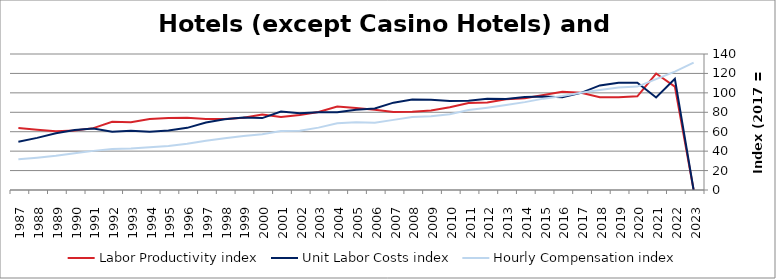
| Category | Labor Productivity index | Unit Labor Costs index | Hourly Compensation index |
|---|---|---|---|
| 2023.0 | 0 | 0 | 131.205 |
| 2022.0 | 106.435 | 114.519 | 121.888 |
| 2021.0 | 119.898 | 95.224 | 114.172 |
| 2020.0 | 96.391 | 110.473 | 106.486 |
| 2019.0 | 95.519 | 110.468 | 105.518 |
| 2018.0 | 95.507 | 107.661 | 102.824 |
| 2017.0 | 100 | 100 | 100 |
| 2016.0 | 101.111 | 95.606 | 96.668 |
| 2015.0 | 97.76 | 96.207 | 94.052 |
| 2014.0 | 94.478 | 95.738 | 90.452 |
| 2013.0 | 93.499 | 93.574 | 87.491 |
| 2012.0 | 90.102 | 94.01 | 84.705 |
| 2011.0 | 89.551 | 91.894 | 82.291 |
| 2010.0 | 85.252 | 91.57 | 78.065 |
| 2009.0 | 81.775 | 92.799 | 75.886 |
| 2008.0 | 80.546 | 93.197 | 75.067 |
| 2007.0 | 80.268 | 89.928 | 72.184 |
| 2006.0 | 82.591 | 83.846 | 69.249 |
| 2005.0 | 84.316 | 82.705 | 69.733 |
| 2004.0 | 85.9 | 79.963 | 68.688 |
| 2003.0 | 80.275 | 80.002 | 64.221 |
| 2002.0 | 77.24 | 79.129 | 61.119 |
| 2001.0 | 75.098 | 80.848 | 60.715 |
| 2000.0 | 77.684 | 74.004 | 57.489 |
| 1999.0 | 74.471 | 74.568 | 55.531 |
| 1998.0 | 73.046 | 72.877 | 53.234 |
| 1997.0 | 73.192 | 69.397 | 50.793 |
| 1996.0 | 74.343 | 63.975 | 47.561 |
| 1995.0 | 74.04 | 61.235 | 45.339 |
| 1994.0 | 73.11 | 60.024 | 43.884 |
| 1993.0 | 69.779 | 61.082 | 42.622 |
| 1992.0 | 70.238 | 60.047 | 42.176 |
| 1991.0 | 63.695 | 63.228 | 40.273 |
| 1990.0 | 61.218 | 61.849 | 37.863 |
| 1989.0 | 60.504 | 58.37 | 35.316 |
| 1988.0 | 62.057 | 53.667 | 33.304 |
| 1987.0 | 63.731 | 49.683 | 31.663 |